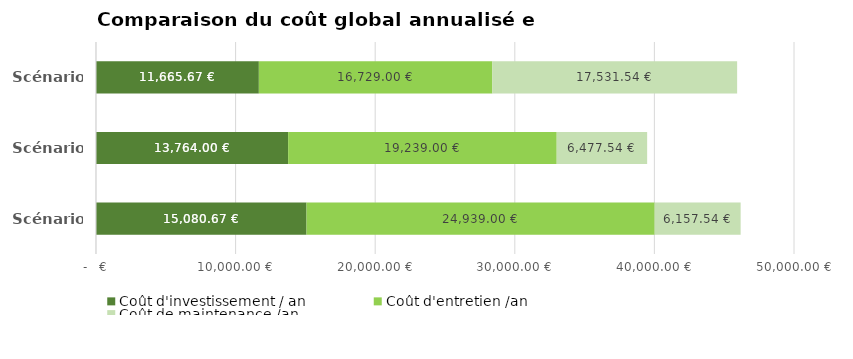
| Category | Coût d'investissement / an | Coût d'entretien /an | Coût de maintenance /an |
|---|---|---|---|
| Scénario 1 | 15080.667 | 24939 | 6157.543 |
| Scénario 2 | 13764 | 19239 | 6477.543 |
| Scénario 3 | 11665.667 | 16729 | 17531.543 |